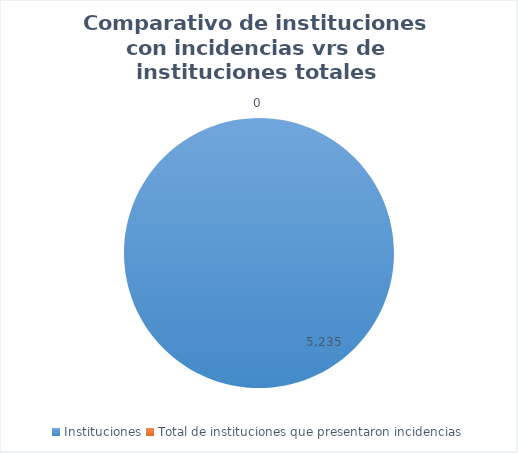
| Category | Series 0 |
|---|---|
| Instituciones  | 5235 |
| Total de instituciones que presentaron incidencias | 0 |